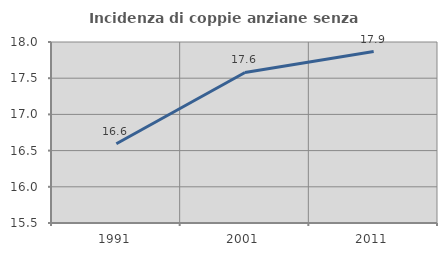
| Category | Incidenza di coppie anziane senza figli  |
|---|---|
| 1991.0 | 16.595 |
| 2001.0 | 17.579 |
| 2011.0 | 17.868 |